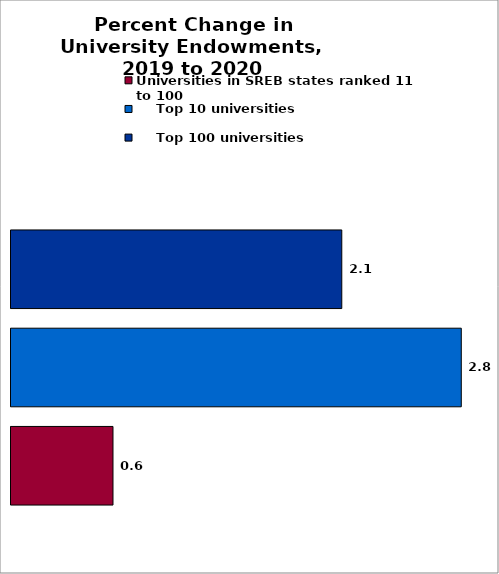
| Category | Universities in SREB states ranked 11 to 100 |     Top 10 universities |     Top 100 universities |
|---|---|---|---|
| 0 | 0.639 | 2.82 | 2.072 |